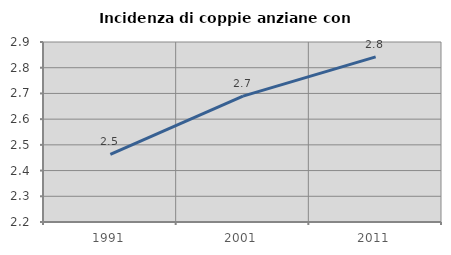
| Category | Incidenza di coppie anziane con figli |
|---|---|
| 1991.0 | 2.463 |
| 2001.0 | 2.689 |
| 2011.0 | 2.842 |